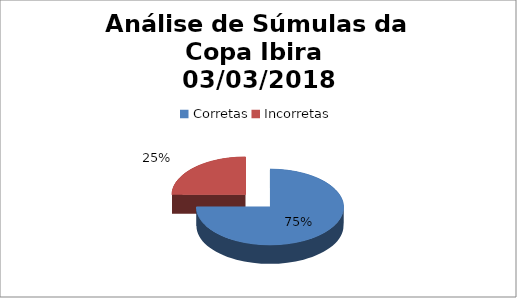
| Category | Series 0 |
|---|---|
| Corretas | 54 |
| Incorretas | 18 |